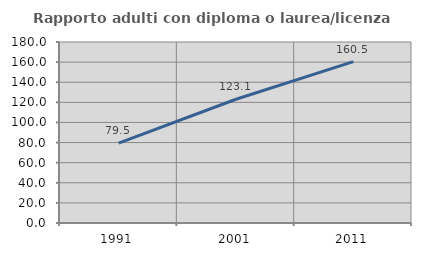
| Category | Rapporto adulti con diploma o laurea/licenza media  |
|---|---|
| 1991.0 | 79.487 |
| 2001.0 | 123.063 |
| 2011.0 | 160.469 |